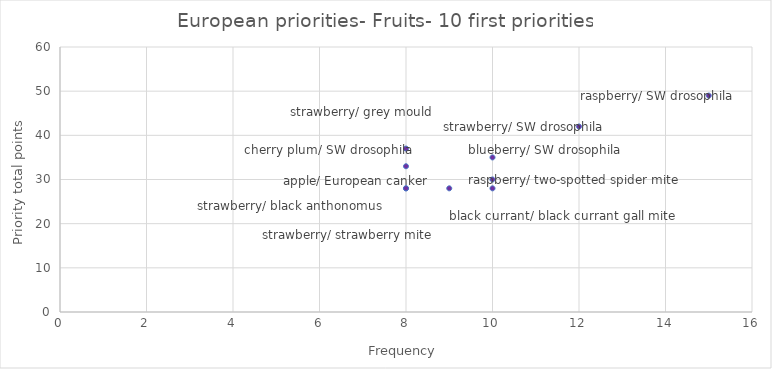
| Category | Priority total points |
|---|---|
| 15.0 | 49 |
| 12.0 | 42 |
| 8.0 | 37 |
| 10.0 | 35 |
| 8.0 | 33 |
| 10.0 | 30 |
| 9.0 | 28 |
| 10.0 | 28 |
| 8.0 | 28 |
| 8.0 | 28 |